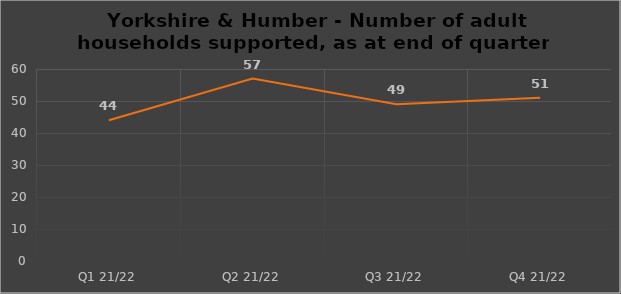
| Category | Number of financially supported households at end of quarter |
|---|---|
| Q1 21/22 | 44 |
| Q2 21/22 | 57 |
| Q3 21/22 | 49 |
| Q4 21/22 | 51 |